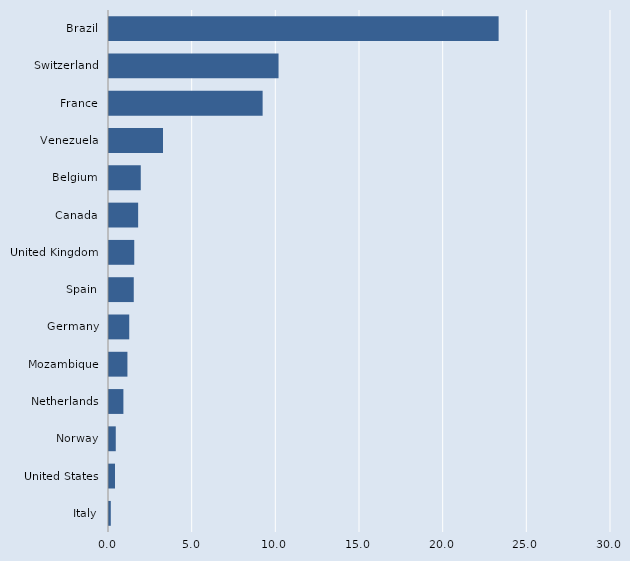
| Category | Series 0 |
|---|---|
| Italy | 0.107 |
| United States | 0.359 |
| Norway | 0.405 |
| Netherlands | 0.861 |
| Mozambique | 1.101 |
| Germany | 1.209 |
| Spain | 1.48 |
| United Kingdom | 1.509 |
| Canada | 1.742 |
| Belgium | 1.898 |
| Venezuela | 3.227 |
| France | 9.181 |
| Switzerland | 10.132 |
| Brazil | 23.284 |